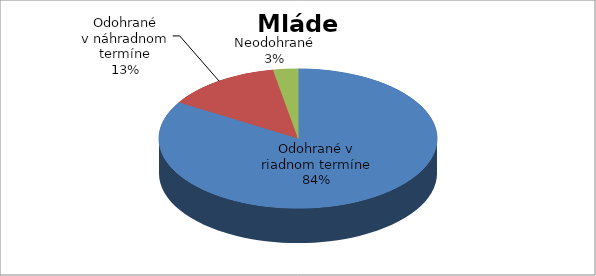
| Category | Series 0 |
|---|---|
| Odohrané v riadnom termíne | 1017 |
| Odohrané v náhradnom termíne | 163 |
| Neodohrané | 35 |